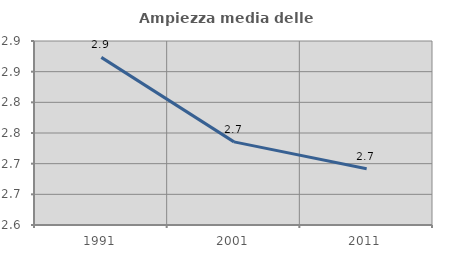
| Category | Ampiezza media delle famiglie |
|---|---|
| 1991.0 | 2.873 |
| 2001.0 | 2.736 |
| 2011.0 | 2.692 |